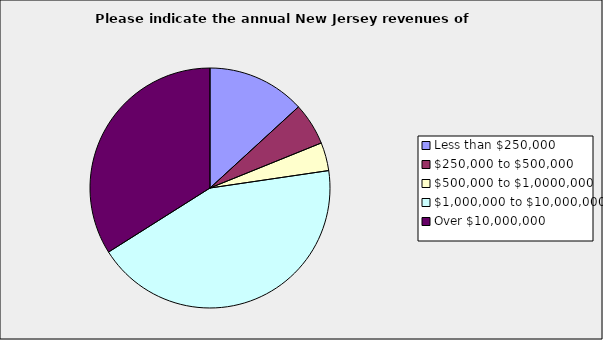
| Category | Series 0 |
|---|---|
| Less than $250,000 | 0.132 |
| $250,000 to $500,000 | 0.057 |
| $500,000 to $1,0000,000 | 0.038 |
| $1,000,000 to $10,000,000 | 0.434 |
| Over $10,000,000 | 0.34 |